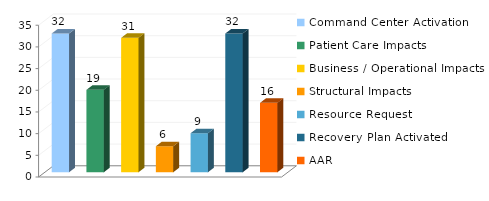
| Category | ALERT TYPE |
|---|---|
| Command Center Activation | 32 |
| Patient Care Impacts | 19 |
| Business / Operational Impacts | 31 |
| Structural Impacts | 6 |
| Resource Request | 9 |
| Recovery Plan Activated | 32 |
| AAR | 16 |